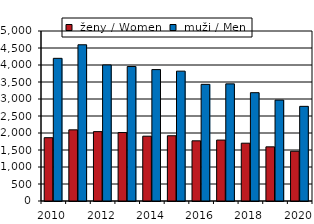
| Category |  ženy / Women  |  muži / Men |
|---|---|---|
| 2010.0 | 1862 | 4196 |
| 2011.0 | 2093 | 4595 |
| 2012.0 | 2040 | 4002 |
| 2013.0 | 2013 | 3955 |
| 2014.0 | 1906 | 3865 |
| 2015.0 | 1919 | 3819 |
| 2016.0 | 1770 | 3431 |
| 2017.0 | 1792 | 3445 |
| 2018.0 | 1700 | 3186 |
| 2019.0 | 1593 | 2968 |
| 2020.0 | 1463 | 2784 |